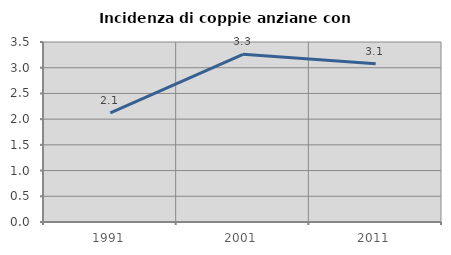
| Category | Incidenza di coppie anziane con figli |
|---|---|
| 1991.0 | 2.12 |
| 2001.0 | 3.261 |
| 2011.0 | 3.077 |